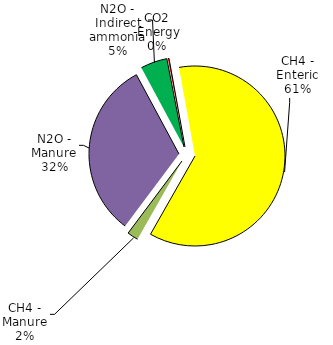
| Category | Series 0 |
|---|---|
| CO2 -Energy | 94.678 |
| CH4 - Enteric | 27153.973 |
| CH4 - Manure | 880.981 |
| N2O - Manure | 14199.187 |
| N2O - Indirect ammonia | 2129.878 |